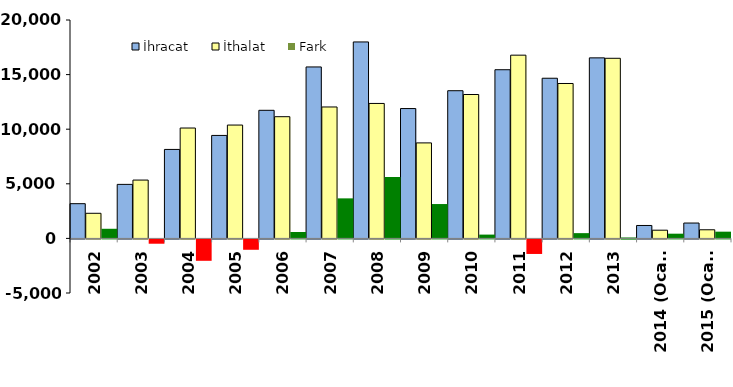
| Category | İhracat | İthalat | Fark |
|---|---|---|---|
| 2002 | 3180 | 2299 | 881 |
| 2003 | 4946 | 5342 | -396 |
| 2004 | 8148 | 10108 | -1960 |
| 2005 | 9429 | 10379 | -950 |
| 2006 | 11730 | 11145 | 585 |
| 2007 | 15701 | 12035 | 3666 |
| 2008 | 17991 | 12358 | 5633 |
| 2009 | 11891 | 8745 | 3146 |
| 2010 | 13525 | 13177 | 348 |
| 2011 | 15447 | 16780 | -1333 |
| 2012 | 14667 | 14185 | 482 |
| 2013 | 16532 | 16494 | 38 |
| 2014 (Ocak) | 1183 | 751 | 432 |
| 2015 (Ocak) | 1406 | 790 | 616 |